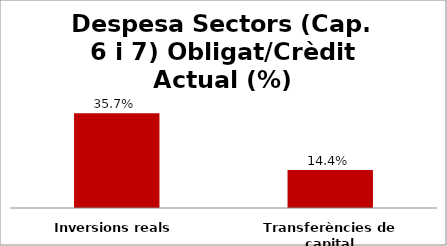
| Category | Series 0 |
|---|---|
| Inversions reals | 0.357 |
| Transferències de capital | 0.144 |